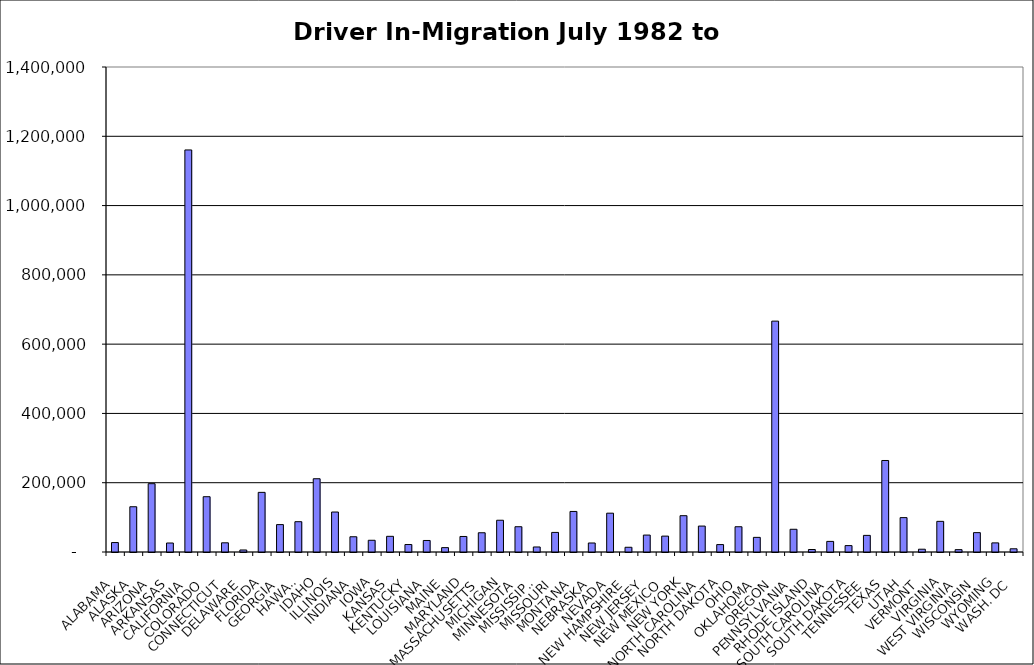
| Category | Series 0 |
|---|---|
| ALABAMA | 27285.5 |
| ALASKA | 130637.5 |
| ARIZONA | 197231 |
| ARKANSAS | 25958.5 |
| CALIFORNIA | 1160550.5 |
| COLORADO | 159609 |
| CONNECTICUT | 26527 |
| DELAWARE | 5835.5 |
| FLORIDA | 172114 |
| GEORGIA | 79080 |
| HAWAII | 87471.5 |
| IDAHO | 211457.5 |
| ILLINOIS | 115392.5 |
| INDIANA | 44014 |
| IOWA | 33859.5 |
| KANSAS | 45264.5 |
| KENTUCKY | 21604 |
| LOUISIANA | 33265.5 |
| MAINE | 12614.5 |
| MARYLAND | 44828 |
| MASSACHUSETTS | 55523 |
| MICHIGAN | 91653 |
| MINNESOTA | 72935.5 |
| MISSISSIPPI | 14513 |
| MISSOURI | 56521 |
| MONTANA | 117064 |
| NEBRASKA | 26003.5 |
| NEVADA | 112048 |
| NEW HAMPSHIRE | 13665.5 |
| NEW JERSEY | 48885 |
| NEW MEXICO | 45847 |
| NEW YORK | 104803 |
| NORTH CAROLINA | 74826.5 |
| NORTH DAKOTA | 21402.5 |
| OHIO | 72923.5 |
| OKLAHOMA | 42227 |
| OREGON | 666407 |
| PENNSYLVANIA | 65603.5 |
| RHODE ISLAND | 7210 |
| SOUTH CAROLINA | 30591.5 |
| SOUTH DAKOTA | 18460.5 |
| TENNESSEE | 47987.5 |
| TEXAS | 264135 |
| UTAH | 99252.5 |
| VERMONT | 8050 |
| VIRGINIA | 88460 |
| WEST VIRGINIA | 6802.5 |
| WISCONSIN | 55917.5 |
| WYOMING | 26315 |
| WASH. DC | 9264 |